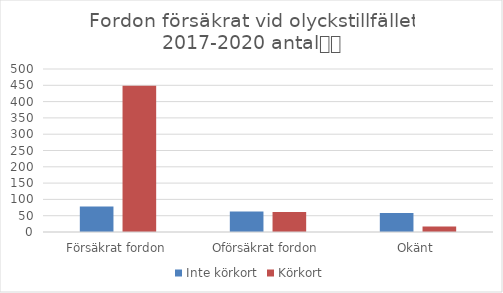
| Category | Inte körkort | Körkort |
|---|---|---|
| Försäkrat fordon | 78 | 449 |
| Oförsäkrat fordon | 63 | 61 |
| Okänt | 58 | 17 |